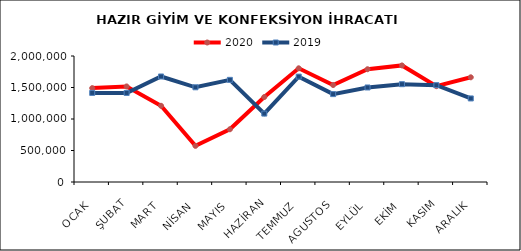
| Category | 2020 | 2019 |
|---|---|---|
| OCAK | 1490224.763 | 1413940.578 |
| ŞUBAT | 1516862.899 | 1413573.074 |
| MART | 1209772.171 | 1674861.508 |
| NİSAN | 573649.662 | 1503254.413 |
| MAYIS | 836955.298 | 1621398.953 |
| HAZİRAN | 1348770.231 | 1085857.365 |
| TEMMUZ | 1804854.082 | 1672649.902 |
| AGUSTOS | 1539281.114 | 1394898.95 |
| EYLÜL | 1789953.921 | 1500335.581 |
| EKİM | 1850321.832 | 1552705.871 |
| KASIM | 1520912.84 | 1537181.266 |
| ARALIK | 1661882.09 | 1326372.347 |